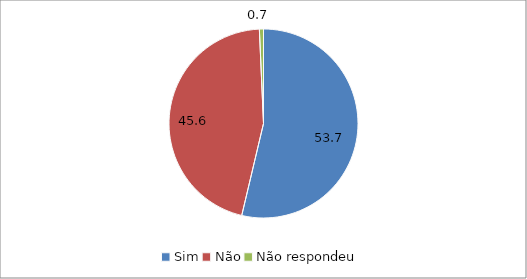
| Category | Series 0 |
|---|---|
| Sim | 53.7 |
| Não | 45.6 |
| Não respondeu | 0.7 |